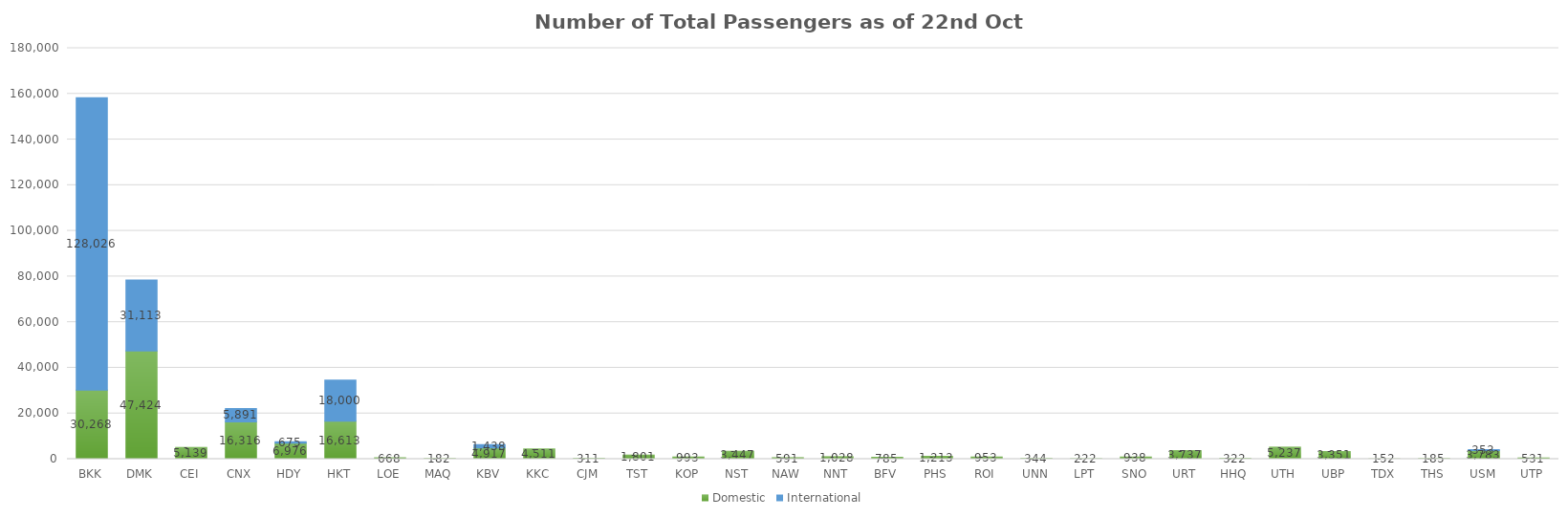
| Category | Domestic | International |
|---|---|---|
| BKK | 30268 | 128026 |
| DMK | 47424 | 31113 |
| CEI | 5139 | 0 |
| CNX | 16316 | 5891 |
| HDY | 6976 | 675 |
| HKT | 16613 | 18000 |
| LOE | 668 | 0 |
| MAQ | 182 | 0 |
| KBV | 4917 | 1438 |
| KKC | 4511 | 0 |
| CJM | 311 | 0 |
| TST | 1801 | 0 |
| KOP | 993 | 0 |
| NST | 3447 | 0 |
| NAW | 591 | 0 |
| NNT | 1028 | 0 |
| BFV | 785 | 0 |
| PHS | 1213 | 0 |
| ROI | 953 | 0 |
| UNN | 344 | 0 |
| LPT | 222 | 0 |
| SNO | 938 | 0 |
| URT | 3737 | 0 |
| HHQ | 322 | 0 |
| UTH | 5237 | 0 |
| UBP | 3351 | 0 |
| TDX | 152 | 0 |
| THS | 185 | 0 |
| USM | 3783 | 353 |
| UTP | 531 | 0 |